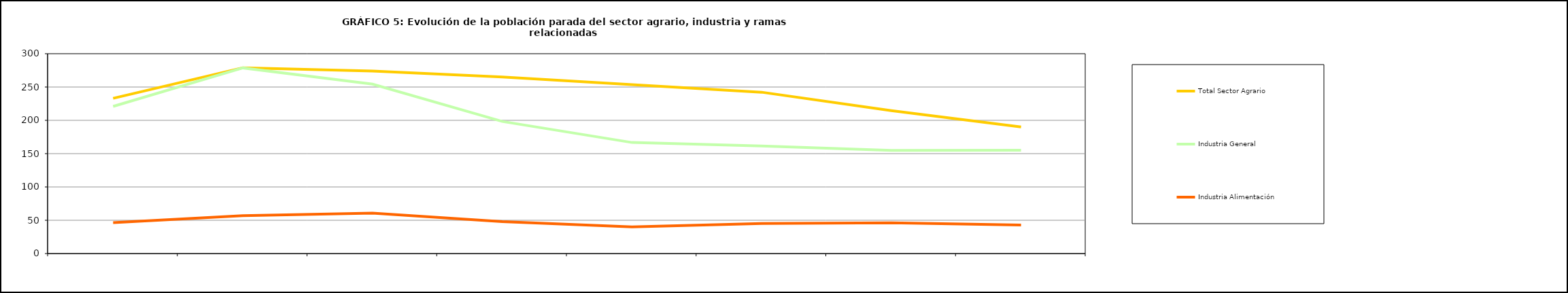
| Category | Total Sector Agrario | Industria General | Industria Alimentación |
|---|---|---|---|
|  | 233.075 | 220.925 | 46.525 |
|  | 278.9 | 278.675 | 56.8 |
|  | 273.925 | 254.3 | 60.8 |
|  | 265.1 | 198.3 | 47.85 |
|  | 253.575 | 166.725 | 40.1 |
|  | 242.2 | 161.6 | 45.23 |
|  | 214.5 | 154.8 | 46.3 |
|  | 190.1 | 154.975 | 42.9 |